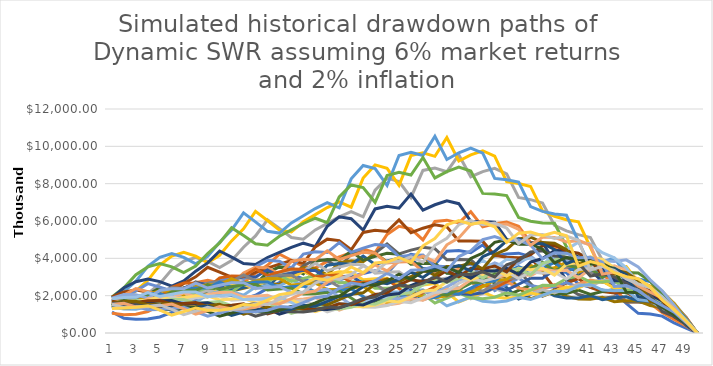
| Category | Series 0 | Series 1 | Series 2 | Series 3 | Series 4 | Series 5 | Series 6 | Series 7 | Series 8 | Series 9 | Series 10 | Series 11 | Series 12 | Series 13 | Series 14 | Series 15 | Series 16 | Series 17 | Series 18 | Series 19 | Series 20 | Series 21 | Series 22 | Series 23 | Series 24 | Series 25 | Series 26 | Series 27 | Series 28 | Series 29 | Series 30 | Series 31 | Series 32 | Series 33 | Series 34 | Series 35 | Series 36 | Series 37 | Series 38 | Series 39 |
|---|---|---|---|---|---|---|---|---|---|---|---|---|---|---|---|---|---|---|---|---|---|---|---|---|---|---|---|---|---|---|---|---|---|---|---|---|---|---|---|---|
| 0 | 1126486.125 | 1051854.096 | 1403711.229 | 1527383.078 | 1720396.947 | 1934856.801 | 1877667.506 | 1936000.586 | 1702954.212 | 1577137.765 | 1432019.93 | 1373829.823 | 1667353.876 | 1785449.769 | 1706671.516 | 1760429.453 | 1395275.809 | 1380120.646 | 1484777.054 | 1665638.197 | 1611165.395 | 1605875.385 | 1586859.945 | 1456468.353 | 1870947.764 | 1651912.767 | 1493069.502 | 1368253.867 | 1836777.161 | 1556406.645 | 1503649.521 | 1700952.587 | 1355815.195 | 1600156.455 | 1584858.319 | 1507509.799 | 1335227.049 | 1546398.519 | 1542824.188 | 1317784.315 |
| 1 | 789670.399 | 984006.089 | 1428861.907 | 1751221.769 | 2218410.952 | 2421207.599 | 2422638.89 | 2197217.073 | 1789934.387 | 1505161.852 | 1311132.285 | 1526599.911 | 1983992.058 | 2030776.299 | 2002318.111 | 1636979.345 | 1283339.691 | 1365660.692 | 1648186.788 | 1788485.018 | 1724314.482 | 1698302.107 | 1540295.901 | 1816047.586 | 2059744.165 | 1643734.397 | 1361479.849 | 1674895.301 | 1905215.281 | 1559675.342 | 1704524.852 | 1536941.064 | 1445864.032 | 1690119.456 | 1592264.076 | 1341466.324 | 1376071.677 | 1590019.217 | 1354956.28 | 1335996.184 |
| 2 | 738475.553 | 1001286.246 | 1637688.922 | 2257368.526 | 2775065.136 | 3122841.935 | 2748553.188 | 2308633.992 | 1707649.218 | 1377617.441 | 1456420.505 | 1815872.531 | 2255809.179 | 2381733.701 | 1861253.939 | 1505125.599 | 1269449.309 | 1515430.316 | 1769127.134 | 1913417.041 | 1822919.806 | 1647891.034 | 1919898.689 | 1998604.329 | 2048829.392 | 1498341.531 | 1666019.876 | 1736693.706 | 1908548.35 | 1767416.496 | 1539629.857 | 1638446.074 | 1526618.033 | 1697422.813 | 1416389.533 | 1382017.969 | 1414392.631 | 1395915.717 | 1373201.112 | 1385544.779 |
| 3 | 751166.574 | 1147199.821 | 2110242.65 | 2822755.828 | 3577921.621 | 3541645.842 | 2886861.397 | 2201690.684 | 1562369.528 | 1529708.122 | 1731755.51 | 2063894.321 | 2644680.068 | 2213122.345 | 1710703.875 | 1488285.142 | 1408147.641 | 1626028.873 | 1892008.319 | 2022089.584 | 1768156.789 | 2053252.262 | 2112115.085 | 1987279.74 | 1866915.393 | 1832818.436 | 1726853.167 | 1739089.798 | 2161959.386 | 1595848.125 | 1640706.615 | 1729317.565 | 1532648.937 | 1509375.559 | 1458667.445 | 1419980.189 | 1241270.619 | 1414189.89 | 1423603.876 | 1464236.81 |
| 4 | 860295.902 | 1477647.474 | 2637752.382 | 3637991.954 | 4056175.435 | 3718413.631 | 2752060.218 | 2013595.266 | 1734181.227 | 1818189.502 | 1967521.357 | 2418739.064 | 2456496.465 | 2033318.502 | 1690904.28 | 1650250.051 | 1510327.932 | 1738293.199 | 1998686.027 | 1960579.158 | 2202243.679 | 2257939.788 | 2099329.167 | 1810125.248 | 2282779.922 | 1899002.157 | 1728562.029 | 1969233.215 | 1951331.095 | 1699953.111 | 1731028.866 | 1735472.888 | 1362325.065 | 1553823.463 | 1498151.268 | 1245688.79 | 1257030.418 | 1465525.987 | 1503871.387 | 1228767.864 |
| 5 | 1107645.76 | 1846263.71 | 3398159.154 | 4122578.293 | 4256871.773 | 3543324.83 | 2515909.871 | 2234108.042 | 2060375.248 | 2064872.751 | 2304847.99 | 2245708.021 | 2255991.209 | 2008958.043 | 1874148.079 | 1769269.892 | 1613939.692 | 1835548.38 | 1937090.163 | 2440901.481 | 2420787.614 | 2243347.684 | 1911399.336 | 2212428.802 | 2364238.729 | 1900099.245 | 1956506.899 | 1776649.902 | 2077770.711 | 1792798.967 | 1736475.501 | 1541974.394 | 1401865.601 | 1595226.373 | 1313724.221 | 1260985.63 | 1302125.526 | 1547520.206 | 1261509.399 | 961767.939 |
| 6 | 1383358.891 | 2377467.031 | 3849124.617 | 4324678.514 | 4054664.42 | 3237868.396 | 2790218.077 | 2653182.315 | 2338899.438 | 2417838.031 | 2139033.754 | 2061510.865 | 2227993.583 | 2225701.015 | 2008442.084 | 1889823.363 | 1703496.265 | 1778206.419 | 2410609.055 | 2681962.159 | 2404097.066 | 2041637.14 | 2335195.186 | 2290380.647 | 2364575.759 | 2149729.314 | 1764400.475 | 1890948.015 | 2190298.719 | 1797657.795 | 1542194.208 | 1586039.037 | 1438593.532 | 1398240.703 | 1329278.152 | 1305654.535 | 1374379.712 | 1297559.259 | 986965.609 | 1144920.349 |
| 7 | 1780556.575 | 2691738.719 | 4035961.644 | 4117355.044 | 3703422.692 | 3589239.212 | 3312083.003 | 3010457.23 | 2737446.265 | 2242862.74 | 1962682.806 | 2034990.11 | 2467232.259 | 2384088.521 | 2144305.114 | 1993770.835 | 1649520.304 | 2211868.295 | 2647459.472 | 2662245.476 | 2186926.112 | 2493161.75 | 2416360.293 | 2289653.23 | 2673996.71 | 1937758.734 | 1877046.543 | 1992440.958 | 2195224.395 | 1595796.733 | 1585535.317 | 1626843.359 | 1260369.441 | 1414144.348 | 1375732.993 | 1377470.5 | 1151854.837 | 1014702.831 | 1174375.929 | 1342517.047 |
| 8 | 2014942.071 | 2821021.194 | 3840607.35 | 3758850.685 | 4103315.239 | 4258472.592 | 3756254.144 | 3521720.648 | 2538104.409 | 2056949.195 | 1936489.656 | 2252406.598 | 2641520.445 | 2544122.589 | 2261148.032 | 1929656.949 | 2050799.223 | 2428008.425 | 2626716.253 | 2420575.305 | 2669281.625 | 2578560.633 | 2414416.148 | 2588008.732 | 2409157.437 | 2060468.442 | 1976829.901 | 1995948.911 | 1947770.834 | 1639845.049 | 1625534.441 | 1424603.113 | 1274083.981 | 1462852.092 | 1450696.512 | 1153882.828 | 900321.892 | 1206791.888 | 1376385.422 | 1219627.227 |
| 9 | 2110628.268 | 2683088.302 | 3504389.764 | 4162578.267 | 4865887.616 | 4827067.271 | 4391907.139 | 3263581.951 | 2326516.253 | 2028450.28 | 2142275.928 | 2410274.304 | 2817379.642 | 2681366.545 | 2187306.294 | 2397846.206 | 2250037.77 | 2407741.002 | 2387038.37 | 2952940.004 | 2759287.973 | 2575155.88 | 2727620.148 | 2330482.193 | 2560396.26 | 2168882.206 | 1979288.037 | 1770044.142 | 2000501.3 | 1680346.348 | 1422722.055 | 1439361.288 | 1317287.19 | 1541766.374 | 1214595.614 | 901441.418 | 1070205.204 | 1413647.221 | 1249749.882 | 1219754.032 |
| 10 | 2006330.463 | 2446862.472 | 3878661.159 | 4933461.046 | 5512564.308 | 5640838.056 | 4067755.752 | 2989876.363 | 2293026.071 | 2242780.096 | 2291169.332 | 2569330.465 | 2967738.457 | 2592381.381 | 2716520.079 | 2629360.224 | 2230034.015 | 2186845.529 | 2910432.458 | 3050839.454 | 2754135.497 | 2907618.246 | 2454856.11 | 2475425.676 | 2693638.325 | 2170389.921 | 1754307.726 | 1816967.573 | 2048787.574 | 1469889.863 | 1436673.539 | 1487353.95 | 1387588.593 | 1290136.942 | 948352.093 | 1070949.165 | 1252961.77 | 1282880.442 | 1249195.341 | 1314369.744 |
| 11 | 1828624.072 | 2706614.282 | 4594291.037 | 5585868.009 | 6438153.402 | 5221469.214 | 3724439.69 | 2945123.443 | 2533837.095 | 2397263.893 | 2440945.34 | 2704877.429 | 2867581.056 | 3217729.866 | 2977070.057 | 2604468.678 | 2024264.212 | 2664793.763 | 3005174.03 | 3043371.716 | 3107896.421 | 2615332.484 | 2606018.622 | 2602731.455 | 2693943.307 | 1922568.894 | 1799766.761 | 1859741.752 | 1791143.127 | 1483440.716 | 1483713.257 | 1565820.427 | 1160447.063 | 1006748.707 | 1126025.761 | 1253103.634 | 1136397.662 | 1281565.497 | 1345312.006 | 1528202.628 |
| 12 | 2021495.028 | 3204014.457 | 5198629.955 | 6519732.189 | 5955823.873 | 4777824.968 | 3666423.727 | 3252405.118 | 2706694.726 | 2552396.537 | 2568130.647 | 2611975.529 | 3557114.349 | 3524172.456 | 2947063.818 | 2362687.504 | 2465154.42 | 2749838.202 | 2995964.816 | 3432161.138 | 2793749.706 | 2774660.281 | 2738346.618 | 2601416.951 | 2384866.291 | 1971168.715 | 1840997.196 | 1624865.571 | 1806538.106 | 1531064.598 | 1561022.045 | 1308693.674 | 904986.371 | 1194624 | 1316733.53 | 1135823.727 | 1134531.059 | 1379319.59 | 1563211.865 | 1490635.723 |
| 13 | 2391414.936 | 3623089.235 | 6063762.098 | 6027322.705 | 5446199.202 | 4700305.718 | 4046298.797 | 3471997.346 | 2879955.261 | 2683622.151 | 2478293.795 | 3237914.597 | 3893315.147 | 3486356.55 | 2671719.425 | 2875394.107 | 2542153.841 | 2739607.741 | 3376475.013 | 3083207.756 | 2961996.67 | 2913633.25 | 2735162.837 | 2301440.286 | 2443543.549 | 2014999.116 | 1607430.055 | 1637753.115 | 1863307.829 | 1609780.773 | 1303824.828 | 1019926.487 | 1073164.643 | 1396030.69 | 1192713.14 | 1133211.979 | 1220266.39 | 1601673.134 | 1523781.116 | 1758752.09 |
| 14 | 2702308.33 | 4223064.153 | 5601859.871 | 5507715.76 | 5354079.207 | 5183663.489 | 4316463.745 | 3691656.193 | 3025898.537 | 2587929.51 | 3070043.112 | 3541461.473 | 3848837.773 | 3158410.006 | 3249206.706 | 2963128.441 | 2530920.313 | 3085393.889 | 3031056.693 | 3266594.752 | 3108171.917 | 2908205.226 | 2418067.005 | 2356411.634 | 2496126.234 | 1758122.841 | 1619043.364 | 1688034.487 | 1957731.951 | 1343607.271 | 1015419.532 | 1208616.687 | 1253214.714 | 1263654.866 | 1189136.262 | 1217993.065 | 1415986.247 | 1560177.586 | 1796598.728 | 2057322.813 |
| 15 | 3147447.701 | 3898456.926 | 5115101.904 | 5410504.509 | 5900250.635 | 5525631.547 | 4586114.944 | 3875831.094 | 2915817.987 | 3203458.498 | 3355340.358 | 3498384.521 | 3484185.645 | 3838220.972 | 3345841.889 | 2947827.691 | 2848234.064 | 2767681.487 | 3208939.315 | 3425237.583 | 3100060.522 | 2569124.608 | 2473971.845 | 2405318.513 | 2176285.534 | 1769500.083 | 1667501.896 | 1772249.693 | 1632803.087 | 1045619.288 | 1202375.735 | 1410336.319 | 1133532.477 | 1258922.709 | 1277145.143 | 1412290.948 | 1378269.523 | 1838135.444 | 2100022.16 | 2154317.979 |
| 16 | 2903195.445 | 3556865.799 | 5020803.496 | 5957665.586 | 6284464.429 | 5866126.856 | 4811064.951 | 3731844.868 | 3606448.707 | 3498355.164 | 3311877.707 | 3164403.919 | 4230731.309 | 3949214.631 | 3325904.09 | 3314759.233 | 2552900.333 | 2927765.194 | 3362092.321 | 3413567.784 | 2736421.419 | 2626420.629 | 2523299.947 | 2095437.032 | 2188617.848 | 1821004.977 | 1749293.252 | 1476924.122 | 1269660.894 | 1237146.032 | 1401932.155 | 1274629.198 | 1128384.862 | 1351015.684 | 1479695.34 | 1373573.753 | 1622520.969 | 2146856.367 | 2197272.558 | 2617138.744 |
| 17 | 2646545.29 | 3488307.252 | 5523824.858 | 6340189.685 | 6666012.407 | 6148597.333 | 4628372.203 | 4611808.319 | 3935073.726 | 3450086.048 | 2993139.65 | 3839143.878 | 4349351.676 | 3922323.065 | 3736697.429 | 2968509.82 | 2698250.784 | 3064874.469 | 3347771.305 | 3010576.429 | 2795055.335 | 2676496.772 | 2196338.207 | 2105508.472 | 2250395.233 | 1908691.479 | 1456546.025 | 1147467.6 | 1500940.378 | 1441239.239 | 1265949.807 | 1267755.383 | 1209892.799 | 1563942.415 | 1437899.165 | 1615609.752 | 1893407.597 | 2244354.01 | 2667037.915 | 2926302.374 |
| 18 | 2593153.186 | 3834272.702 | 5873103.041 | 6718954.304 | 6980592.888 | 5909689.999 | 5714490.75 | 5027429.081 | 3877220.434 | 3115187.604 | 3628031.471 | 3943165.993 | 4315774.456 | 4402741.271 | 3343305.211 | 3134646.22 | 2822021.712 | 3049021.102 | 2949840.264 | 3072265.026 | 2845734.927 | 2327548.036 | 2204871.003 | 2162954.814 | 2356595.218 | 1587811.404 | 1130597.578 | 1355244.708 | 1746948.665 | 1300250.886 | 1257968.246 | 1358084.194 | 1399293.608 | 1518373.007 | 1689719.067 | 1883613.758 | 1977580.075 | 2721687.193 | 2979361.721 | 2823919.162 |
| 19 | 2847532.189 | 4072704.688 | 6217835.946 | 7029105.842 | 6702752.15 | 7289305.629 | 6223353.08 | 4948639.018 | 3497413.441 | 3772250.06 | 3722664.687 | 3908872.255 | 4839614.239 | 3935350.868 | 3526941.618 | 3275207.157 | 2804660.461 | 2683955.738 | 3007320.549 | 3124891.29 | 2472285.238 | 2334290.082 | 2262798.292 | 2262798.292 | 1958485.573 | 1231274.707 | 1334005.26 | 1575820.061 | 1574502.761 | 1290780.966 | 1346272.928 | 1569136.973 | 1357184.118 | 1782529.6 | 1968077.043 | 1965413.88 | 2395814.17 | 3037417.258 | 2872291.393 | 3090554.663 |
| 20 | 3021400.914 | 4307193.18 | 6497966.169 | 6742185.92 | 8258751.75 | 7929993.993 | 6119332.541 | 4459149.655 | 4230610.414 | 3866545.627 | 3686380.234 | 4378680.675 | 4321264.319 | 4147109.437 | 3681190.592 | 3251610.422 | 2466238.1 | 2733357.034 | 3055594.712 | 2711932.254 | 2476820.531 | 2393080.303 | 2364743.437 | 1878542.471 | 1517106.99 | 1451256.71 | 1549480.939 | 1418762.495 | 1561380 | 1379925.938 | 1553842.747 | 1520304.447 | 1591610.648 | 2073977.938 | 2051370.244 | 2378553.157 | 2670909.463 | 2925159.224 | 3140164.917 | 3538541.877 |
| 21 | 3191712.166 | 4496105.259 | 6225611.563 | 8297856.276 | 8974392.157 | 7788546.273 | 5507750.523 | 5387807.125 | 4331413.364 | 3824487.814 | 4124733.163 | 3905236.081 | 4548590.094 | 4323539.804 | 3650496.772 | 2855993.077 | 2508764.811 | 2774063.026 | 2648766.074 | 2713805.588 | 2536301.737 | 2498040.02 | 1960934.727 | 1453519.236 | 1786115.028 | 1683747.134 | 1393455.954 | 1405331.62 | 1667307.755 | 1590866.23 | 1503767.546 | 1780871.426 | 1849729.193 | 2159285.265 | 2479743.881 | 2648639.382 | 2569260.584 | 3194312.522 | 3591238.93 | 3234477.913 |
| 22 | 3327591.178 | 4302344.374 | 7652640.816 | 9005766.143 | 8803446.207 | 7001494.241 | 6646582.17 | 5509380.454 | 4279015.895 | 4273986.408 | 3674210.235 | 4105607.124 | 4736252.989 | 4282203.011 | 3202393.812 | 2901657.993 | 2542986.389 | 2401752.797 | 2647327.231 | 2775551.169 | 2644278.32 | 2068914.894 | 1515399.113 | 1709141.913 | 2069694.183 | 1512334.998 | 1378562.593 | 1498822.147 | 1919807.928 | 1537699.352 | 1759328.076 | 2067131.029 | 1923437.883 | 2606975.336 | 2757915.294 | 2544696.223 | 2802206.738 | 3648659.807 | 3278598.804 | 3756822.742 |
| 23 | 3179936.425 | 5281463.138 | 8294416.895 | 8822427.748 | 7903270.013 | 8437904.916 | 6787484.883 | 5435466.269 | 4775551.451 | 3802078.282 | 3857570.495 | 4269286.036 | 4684707.25 | 3751541.846 | 3249253.412 | 2937312.018 | 2198749.685 | 2397243.227 | 2703945.328 | 2889849.706 | 2187107.713 | 1596710.902 | 1779525.202 | 1977855.924 | 1856509.114 | 1494173.467 | 1468309.29 | 1723502.373 | 1853170.263 | 1796624.553 | 2039398.273 | 2146632.964 | 2319128.645 | 2895548.155 | 2646146.044 | 2771709.672 | 3196508.879 | 3326573.487 | 3802984.575 | 3803689.419 |
| 24 | 3897962.739 | 5716088.525 | 8113784.487 | 7908832.506 | 9510883.759 | 8604294.906 | 6686719.096 | 6057404.788 | 4242106.906 | 3986034.799 | 4005547.615 | 4216702.681 | 4098218.997 | 3800920.654 | 3284411.818 | 2536016.061 | 2191440.826 | 2444964.414 | 2811215.169 | 2386758.223 | 1685481.537 | 1872291.94 | 2056320.635 | 1771559.412 | 1831556.271 | 1589140.295 | 1685968.646 | 1661267.583 | 2162078.134 | 2079613.879 | 2114764.435 | 2584488.664 | 2572106.059 | 2774174.92 | 2878032.97 | 3157138.558 | 2910112.827 | 3853040.486 | 3844847.076 | 4044732.092 |
| 25 | 4212081.939 | 5582786.101 | 7262099.087 | 9502565.387 | 9683134.588 | 8463186.775 | 7440074.859 | 5372285.836 | 4440338.459 | 4132411.369 | 3949972.394 | 3682986.44 | 4145611.545 | 3835988.183 | 2831222.22 | 2523599.264 | 2231539.738 | 2537950.563 | 2318150.846 | 1836439.77 | 1973266.355 | 2160104.158 | 1838934.826 | 1744991.583 | 1944893.927 | 1821833.239 | 1622525.881 | 1935129.737 | 2498683.193 | 2153064.758 | 2542103.742 | 2861891.063 | 2460403.614 | 3012522.025 | 3273076.11 | 2869736.284 | 3365353.675 | 3889309.585 | 4082049.04 | 3764291.539 |
| 26 | 4106770.176 | 4988169.893 | 8710482.345 | 9658006.804 | 9507933.873 | 9400472.807 | 6587207.835 | 5613647.307 | 4595471.56 | 4068059.116 | 3444076.157 | 3719162.112 | 4176655.047 | 3300997.219 | 2812508.841 | 2565351.116 | 2312420.371 | 2089211.027 | 1780580.039 | 2146297.634 | 2272680.482 | 1928420.514 | 1808237.611 | 1849781.948 | 2225839.513 | 1750258.948 | 1886747.031 | 2232551.284 | 2582480.952 | 2583687.061 | 2810109.756 | 2732889.853 | 2667192.073 | 3420126.079 | 2969996.905 | 3312946.48 | 3391182.792 | 4122144.453 | 3792479.609 | 4671452.04 |
| 27 | 3662442.964 | 5971748.288 | 8836271.831 | 9465376.945 | 10541008.099 | 8307186.886 | 6870171.849 | 5798816.336 | 4515376.963 | 3540349.715 | 3471346.434 | 3739946.023 | 3587374.597 | 3272994.83 | 2853648.92 | 2653317.363 | 1899967.448 | 1601704.293 | 2077088.401 | 2467305.009 | 2025096.18 | 1892653.56 | 1913211.229 | 2112996.057 | 2134360.404 | 2031442.674 | 2172627.412 | 2303072.436 | 3093144.203 | 2850691.007 | 2678382.107 | 2956992.93 | 3022361.438 | 3097577.857 | 3422225.715 | 3332077.775 | 3587419.092 | 3822508.554 | 4697557.664 | 5058004.124 |
| 28 | 4375523.486 | 6045430.724 | 8642081.68 | 10472076.365 | 9295768.995 | 8646077.17 | 7082078.285 | 5685938.737 | 3921496.335 | 3560986.009 | 3483510.11 | 3205622.273 | 3549570.297 | 3313987.429 | 2945383.286 | 2175541.964 | 1453600.564 | 1864552.911 | 2382795.474 | 2193961.514 | 1983416.538 | 1998377.085 | 2180921.145 | 2021955.004 | 2472116.381 | 2334398.756 | 2236610.198 | 2752767.488 | 3405722.785 | 2711429.333 | 2892008.634 | 3343807.644 | 2731652.222 | 3561834.834 | 3434853.767 | 3517587.728 | 3319756.779 | 4724939.192 | 5075727.484 | 5796329.329 |
| 29 | 4419380.281 | 5899050.948 | 9539351.519 | 9213859.284 | 9652860.911 | 8892376.232 | 6928339.244 | 4926807.295 | 3935333.262 | 3565291.011 | 2978994.402 | 3164586.705 | 3585807.06 | 3412697.013 | 2409493.078 | 1660626.586 | 1688274.474 | 2134086.885 | 2113968.59 | 2143891.881 | 2089420.465 | 2272794.042 | 2082180.439 | 2336567.022 | 2834294.56 | 2397649.456 | 2667213.819 | 3024017.199 | 3231938.131 | 2920995.846 | 3262843.055 | 3015267.819 | 3133881.363 | 3566801.809 | 3617792.542 | 3247690.896 | 4094111.096 | 5093637.094 | 5803336.715 | 6026521.289 |
| 30 | 4301442.834 | 6495020.357 | 8371928.509 | 9543555.09 | 9902677.916 | 8677290.447 | 5988119.078 | 4931660.393 | 3930104.668 | 3041203.486 | 2933406.318 | 3188790.734 | 3683254.069 | 2784706.837 | 1834543.814 | 1923835.089 | 1927428.706 | 1888520.677 | 2060488.944 | 2252748.336 | 2370316.661 | 2164394.218 | 2400064.991 | 2672096.864 | 2903711.818 | 2852010.392 | 2922607.153 | 2862436.652 | 3472910.342 | 3287194.657 | 2934801.109 | 3450491.177 | 3130297.661 | 3747246.552 | 3331741.461 | 3995084.123 | 4402397.802 | 5809053.23 | 6018514.284 | 5823307.167 |
| 31 | 4722643.307 | 5684074.943 | 8647025.522 | 9762912.804 | 9635884.359 | 7478560.96 | 5977101.555 | 4911208.625 | 3342929.614 | 2986211.997 | 2947500.337 | 3266204.697 | 2996995.193 | 2114241.078 | 2119320.133 | 2190159.433 | 1700828.758 | 1835549.594 | 2159000.32 | 2548389.592 | 2250895.185 | 2487789.469 | 2736967.1 | 2729815.821 | 3444225.263 | 3116279.009 | 2758637.849 | 3067178.403 | 3897271.618 | 2948360.15 | 3348931.955 | 3436818.73 | 3279378.518 | 3441220.672 | 4086910.755 | 4283790.353 | 5006558.092 | 6007440.837 | 5799157.709 | 5932972.023 |
| 32 | 4119933.543 | 5852303.111 | 8817830.636 | 9469872.298 | 8278492.689 | 7441218.06 | 5933509.502 | 4164254.708 | 3272112.111 | 2991080.234 | 3009518.585 | 2649253.731 | 2268228.79 | 2434718.572 | 2405083.945 | 1926565.526 | 1647899.628 | 1917230.493 | 2434622.54 | 2412351.077 | 2579041.431 | 2828042.857 | 2787253.777 | 3227729.778 | 3751479.392 | 2932151.247 | 2946616.594 | 3431088.556 | 3484508.848 | 3353775.349 | 3325123.768 | 3589122.85 | 3002047.699 | 4207868.609 | 4368408.271 | 4856282.826 | 5161182.222 | 5770200.619 | 5889701.815 | 5686665.111 |
| 33 | 4226777.28 | 5946671.678 | 8522727.495 | 8106921.172 | 8207849.799 | 7360667.097 | 5013172.884 | 4061536.548 | 3265786.126 | 3043150.047 | 2432368.232 | 1997912.684 | 2602754.811 | 2753179.845 | 2108096.226 | 1859970.634 | 1715106.52 | 2154296.108 | 2296457.78 | 2754201.411 | 2921344.793 | 2869756.576 | 3283919.273 | 3503162.824 | 3517262.135 | 3120810.84 | 3284495.396 | 3056785.479 | 3949545.71 | 3318085.69 | 3460123.897 | 3273908.235 | 3657795.096 | 4481695.794 | 4934590.536 | 4988454.807 | 4939724.644 | 5839443.203 | 5625107.131 | 4853094.93 |
| 34 | 4277610.555 | 5724473.372 | 7266665.328 | 8005322.081 | 8086252.043 | 6193882.247 | 4869792.885 | 4037333.81 | 3309236.242 | 2449629.414 | 1826951.427 | 2283324.477 | 2931323.837 | 2403474.406 | 2027017.332 | 1928018.329 | 1919406.211 | 2023843.622 | 2611309.677 | 3107169.348 | 2952477.656 | 3367485.607 | 3549771.153 | 3271200.951 | 3728469.053 | 3464632.713 | 2914381.628 | 3450764.037 | 3891755.094 | 3438873.186 | 3143507.907 | 3972949.235 | 3880112.395 | 5042141.204 | 5048448.386 | 4755151.069 | 4978837.993 | 5554611.099 | 4781197.238 | 5350102.553 |
| 35 | 4098802.875 | 4858322.128 | 7142532.572 | 7850383.886 | 6773096.347 | 5989008.986 | 4818468.177 | 4072198.15 | 2651545.018 | 1831438.239 | 2078319.633 | 2559719.548 | 2547199.325 | 2300386.151 | 2091494.584 | 2147737.338 | 1794868.611 | 2290715.089 | 2932390.589 | 3125812.597 | 3448589.64 | 3623329.607 | 3299449.361 | 3451653.89 | 4120164.062 | 3060054.602 | 3274846.387 | 3384603.759 | 4014840.321 | 3109805.872 | 3797128.389 | 4195001.878 | 4345213.764 | 5134711.108 | 4790164.285 | 4770718.422 | 4714161.157 | 4699522.472 | 5246554.535 | 5405054.839 |
| 36 | 3460155.014 | 4749972.92 | 6967100.418 | 6540615.661 | 6514289.116 | 5894421.998 | 4834271.023 | 3245546.913 | 1971871.683 | 2072360.82 | 2317527.248 | 2212479.587 | 2425001.042 | 2360955.396 | 2317472.073 | 1997720.334 | 2020759.097 | 2558717.098 | 2934320.758 | 3631663.428 | 3690892.274 | 3349937.544 | 3462974.076 | 3794014.304 | 3619713.853 | 3420278.297 | 3195002.913 | 3473108.596 | 3611379.691 | 3736472.239 | 3988064.573 | 4672902.894 | 4401491.958 | 4846143.365 | 4780327.265 | 4493119.511 | 3967274.53 | 5129547.056 | 5272297.949 | 5219042.414 |
| 37 | 3362077.779 | 4604668.272 | 5768822.545 | 6251810.133 | 6371778.407 | 5877201.74 | 3829105.723 | 2398694.341 | 2217476.978 | 2296599.446 | 1990760.938 | 2093320.107 | 2473468.259 | 2599877.715 | 2142275.92 | 2235238.886 | 2243226.421 | 2544575.928 | 3388110.887 | 3862805.287 | 3391310.942 | 3494232.971 | 3782930.282 | 3312577.657 | 4020813.068 | 3316264.362 | 3258285.705 | 3104778.421 | 4312300.395 | 3900102.614 | 4414933.356 | 4704168.792 | 4128454.767 | 4806299.76 | 4474342.137 | 3757882.3 | 4303530.802 | 5122855.972 | 5059388.637 | 5390398.587 |
| 38 | 3235505.765 | 3784954.516 | 5473958.958 | 6070530.162 | 6306918.868 | 4621300.063 | 2809387.1 | 2677827.436 | 2439530.26 | 1958424.007 | 1869832.439 | 2119616.365 | 2703950.193 | 2385838.406 | 2379533.74 | 2463256.968 | 2214590.647 | 2916705.972 | 3577519.809 | 3523435.012 | 3511639.822 | 3789292.771 | 3278858.301 | 3652859.077 | 3870158.832 | 3357331.733 | 2891536.098 | 3680388.568 | 4468383.988 | 4286128.737 | 4412121.866 | 4380238.129 | 4064707.821 | 4465906.441 | 3714938.257 | 4046718.94 | 4266632.63 | 4880198.068 | 5187466.456 | 5208137.484 |
| 39 | 2636413.263 | 3560278.858 | 5269038.495 | 5956514.387 | 4916089.802 | 3361146.081 | 3109053.916 | 2920375.322 | 2062227.962 | 1823472.832 | 1876866.153 | 2296987.35 | 2459777.275 | 2627038.755 | 2599480.933 | 2410677.216 | 2516400.086 | 3052994.878 | 3234852.545 | 3616742.696 | 3775072.204 | 3255828.091 | 3584251.633 | 3485433.631 | 3884032.844 | 2953538.96 | 3397822.387 | 3780455.646 | 4867978.572 | 4246171.703 | 4072595.88 | 4275122.042 | 3744010.806 | 3675708.173 | 3965705.521 | 3977153.656 | 4029206.691 | 4960251.561 | 4968506.417 | 3577545.627 |
| 40 | 2453753.916 | 3390845.62 | 5115535.617 | 4593978.156 | 3537831.91 | 3680427.146 | 3354891.692 | 2442661.567 | 1899867.929 | 1811023.463 | 2012467.193 | 2067520.708 | 2679880.365 | 2839588.55 | 2517156.089 | 2710313.078 | 2606197.259 | 2731446.415 | 3285488.897 | 3847043.331 | 3209391.771 | 3521530.681 | 3383892.507 | 3461027.817 | 3380846.943 | 3434068.284 | 3453387.519 | 4075083.252 | 4771722.353 | 3878069.05 | 3932930.582 | 3896282.565 | 3049036.789 | 3882433.747 | 3856416.723 | 3716215.015 | 4052098.257 | 4700763.735 | 3376935.486 | 3824126.739 |
| 41 | 2306451.787 | 3249055.513 | 3893832.059 | 3262839.31 | 3823291.443 | 3919564.8 | 2769443.48 | 2220953.227 | 1862248.205 | 1916500.587 | 1787760.95 | 2223099.305 | 2858865.45 | 2713740.399 | 2793057.763 | 2770361.39 | 2301247.162 | 2737962.987 | 3449044.849 | 3227854.298 | 3425958.661 | 3281246.945 | 3316303.002 | 2973288.69 | 3879547.784 | 3444632.867 | 3673897.423 | 3942324.478 | 4301129.558 | 3696152.434 | 3537590.686 | 3131593.543 | 3178447.678 | 3726120.725 | 3556327.876 | 3688507.135 | 3789955.074 | 3153223.142 | 3562535.762 | 3662568.042 |
| 42 | 2173360.483 | 2432100.441 | 2719707.806 | 3467641.303 | 4004195.743 | 3181926.343 | 2476320.716 | 2140877.591 | 1938030.981 | 1674279.137 | 1890413.077 | 2332251.836 | 2686858.968 | 2961258.645 | 2807599.484 | 2405640.238 | 2268487.68 | 2826602.13 | 2845928.323 | 3388531.893 | 3139263.925 | 3162385.666 | 2801718.284 | 3355296.822 | 3826955.314 | 3603818.61 | 3495273.615 | 3494604.214 | 4031392.949 | 3269485.727 | 2796152.133 | 3210377.2 | 2999896.052 | 3379193.254 | 3471281.705 | 3392680.739 | 2500107.107 | 3271368.332 | 3355451.209 | 3229205.894 |
| 43 | 1591543.86 | 1661839.235 | 2827634.029 | 3552830.86 | 3180021.406 | 2783344.59 | 2335187.65 | 2179603.306 | 1656311.795 | 1731958.98 | 1940152.036 | 2144317.396 | 2868239.307 | 2912017.955 | 2385019.19 | 2319884.21 | 2291057.581 | 2281667.038 | 2922698.946 | 3037524.288 | 2959826.242 | 2613650.806 | 3093006.278 | 3237916.924 | 3916840.115 | 3354127.337 | 3031023.327 | 3204299.295 | 3488567.853 | 2528105.138 | 2804231.999 | 2964214.808 | 2661489.668 | 3226736.973 | 3123522.906 | 2189424.716 | 2537440.253 | 3014280.134 | 2894165.975 | 3019148.029 |
| 44 | 1055241.142 | 1676546.34 | 2811183.315 | 2737882.955 | 2699184.058 | 2546874.079 | 2306922.52 | 1807525.525 | 1662560.403 | 1724813.945 | 1730912.009 | 2221187.306 | 2736898.502 | 2400359.962 | 2231788.879 | 2273481.843 | 1794523.677 | 2273725.307 | 2542247.719 | 2778969.293 | 2373692.999 | 2799816.074 | 2896284.096 | 3215686.901 | 3537350.291 | 2822365.458 | 2696807.57 | 2690609.793 | 2617510.676 | 2460219.617 | 2512425.269 | 2551842.419 | 2466044.574 | 2817370.76 | 1955948.07 | 2156218.802 | 2268692.279 | 2522793.588 | 2625655.271 | 2911555.09 |
| 45 | 1018961.593 | 1595368.728 | 2073523.96 | 2224318.023 | 2364027.598 | 2408231.555 | 1831131.508 | 1736598.106 | 1584753.179 | 1472858.509 | 1716131.848 | 2028654.261 | 2159337.681 | 2149894.513 | 2093427.073 | 1704449.838 | 1711648.035 | 1893003.098 | 2226185.763 | 2133151.134 | 2433806.427 | 2509397.185 | 2753142.941 | 2779684.638 | 2848992.569 | 2403551.732 | 2167440.323 | 1932286.643 | 2438073.272 | 2109757.964 | 2070221.805 | 2263130.179 | 2060918.917 | 1688636.506 | 1843740.002 | 1845236.95 | 1817411.392 | 2190662.817 | 2423582.772 | 2466480.03 |
| 46 | 904429.391 | 1097620.743 | 1571311.903 | 1817139.473 | 2085041.248 | 1783019.567 | 1640989.337 | 1544026.897 | 1262268.5 | 1362096.971 | 1461991.491 | 1492936.199 | 1803983.995 | 1881019.155 | 1463935.391 | 1516424.655 | 1329226.939 | 1546201.887 | 1593935.044 | 2040114.069 | 2034685.439 | 2224991.451 | 2219841.008 | 2088238.577 | 2263095.503 | 1801863.98 | 1451908.747 | 1678808.591 | 1950189.666 | 1621540.127 | 1712552.53 | 1764171.732 | 1152190.835 | 1484738.163 | 1471737.418 | 1378799.557 | 1472035.908 | 1886110.041 | 1915057.366 | 1775744.973 |
| 47 | 547420.783 | 731747.136 | 1129299.576 | 1409956.631 | 1358087.965 | 1405716.414 | 1283561.496 | 1081932.975 | 1026961.415 | 1020839.825 | 946527.942 | 1097257.981 | 1388558.336 | 1157211.325 | 1145813.423 | 1036002.704 | 955145.188 | 973936.854 | 1341092.787 | 1500448.444 | 1587126.71 | 1578253.786 | 1467107.174 | 1459308.334 | 1492542.803 | 1061865.619 | 1109747.91 | 1181371.973 | 1318643.199 | 1180076.35 | 1174439.387 | 867680.331 | 891237.593 | 1042643.663 | 967463.763 | 982475.38 | 1114975.379 | 1311131.771 | 1212942.354 | 1247787.33 |
| 48 | 265099.168 | 382020.047 | 636509.683 | 667109.863 | 777764.05 | 798706.088 | 653341.934 | 639412.464 | 559090.434 | 480092.096 | 505334.904 | 613505.635 | 620528.803 | 657935.058 | 568633.334 | 540766.157 | 437031.107 | 595247.206 | 716479.569 | 850185.626 | 817783.702 | 757696.303 | 744744.229 | 699116.148 | 638929.158 | 589566.681 | 567267.854 | 580250.428 | 697088.733 | 587861.706 | 419592.637 | 487536.563 | 454629.791 | 497873.076 | 500764.584 | 540563.735 | 563018.868 | 603230.195 | 619125.221 | 658197.066 |
| 49 | -18059.616 | -28096.81 | -39298.108 | -49853.12 | -57664.982 | -53050.058 | -50384.423 | -45423.861 | -34310.262 | -33446.096 | -36869.235 | -35775.968 | -46037.032 | -42606.558 | -38730.754 | -32286.984 | -34854.105 | -41497.064 | -52975.066 | -57163.081 | -51230.878 | -50189.803 | -46556.941 | -39052.628 | -46290.418 | -39325.277 | -36357.331 | -40026.835 | -45313.556 | -27406.113 | -30764.532 | -32452.384 | -28327.982 | -33627.343 | -35952.894 | -35618.826 | -33801.401 | -40178.75 | -42615.627 | -40842.444 |